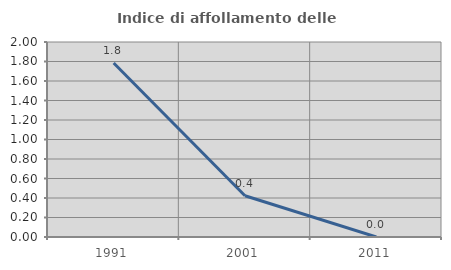
| Category | Indice di affollamento delle abitazioni  |
|---|---|
| 1991.0 | 1.784 |
| 2001.0 | 0.423 |
| 2011.0 | 0 |